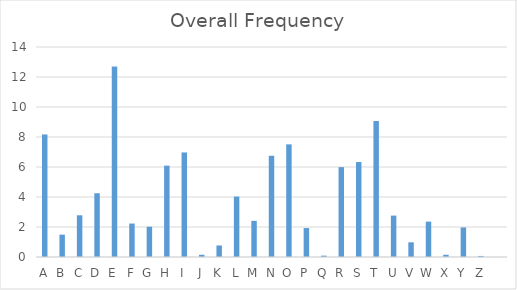
| Category | Overall Frequency |
|---|---|
| A | 8.17 |
| B | 1.49 |
| C | 2.78 |
| D | 4.25 |
| E | 12.7 |
| F | 2.23 |
| G | 2.02 |
| H | 6.09 |
| I | 6.97 |
| J | 0.15 |
| K | 0.77 |
| L | 4.03 |
| M | 2.41 |
| N | 6.75 |
| O | 7.51 |
| P | 1.93 |
| Q | 0.09 |
| R | 5.99 |
| S | 6.33 |
| T | 9.06 |
| U | 2.76 |
| V | 0.98 |
| W | 2.36 |
| X | 0.15 |
| Y | 1.97 |
| Z | 0.07 |